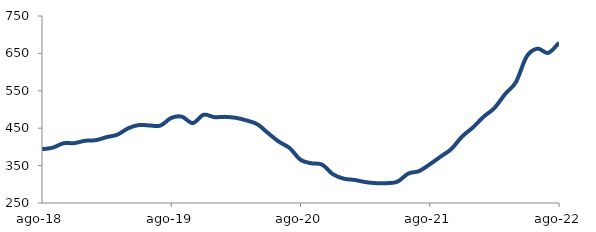
| Category | Series 0 |
|---|---|
| 2018-08-01 | 393.899 |
| 2018-09-01 | 397.981 |
| 2018-10-01 | 409.711 |
| 2018-11-01 | 410.128 |
| 2018-12-01 | 416.457 |
| 2019-01-01 | 418.023 |
| 2019-02-01 | 426.141 |
| 2019-03-01 | 432.718 |
| 2019-04-01 | 449.714 |
| 2019-05-01 | 458.458 |
| 2019-06-01 | 457.312 |
| 2019-07-01 | 457.058 |
| 2019-08-01 | 477.544 |
| 2019-09-01 | 480.652 |
| 2019-10-01 | 463.67 |
| 2019-11-01 | 485.887 |
| 2019-12-01 | 479.593 |
| 2020-01-01 | 480.293 |
| 2020-02-01 | 477.774 |
| 2020-03-01 | 470.708 |
| 2020-04-01 | 460.537 |
| 2020-05-01 | 436.562 |
| 2020-06-01 | 413.857 |
| 2020-07-01 | 396.652 |
| 2020-08-01 | 365.687 |
| 2020-09-01 | 356.18 |
| 2020-10-01 | 352.658 |
| 2020-11-01 | 327.164 |
| 2020-12-01 | 315.173 |
| 2021-01-01 | 311.708 |
| 2021-02-01 | 306.103 |
| 2021-03-01 | 303.075 |
| 2021-04-01 | 303.034 |
| 2021-05-01 | 306.996 |
| 2021-06-01 | 328.614 |
| 2021-07-01 | 335.232 |
| 2021-08-01 | 353.414 |
| 2021-09-01 | 373.869 |
| 2021-10-01 | 394.393 |
| 2021-11-01 | 427.592 |
| 2021-12-01 | 451.83 |
| 2022-01-01 | 480.528 |
| 2022-02-01 | 503.882 |
| 2022-03-01 | 541.428 |
| 2022-04-01 | 573.261 |
| 2022-05-01 | 641.774 |
| 2022-06-01 | 662.728 |
| 2022-07-01 | 651.267 |
| 2022-08-01 | 678.506 |